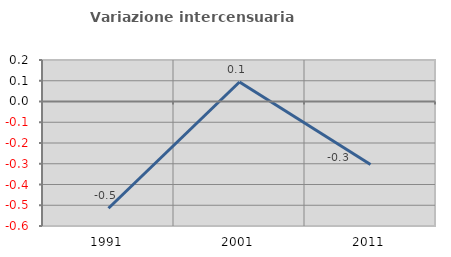
| Category | Variazione intercensuaria annua |
|---|---|
| 1991.0 | -0.514 |
| 2001.0 | 0.094 |
| 2011.0 | -0.304 |